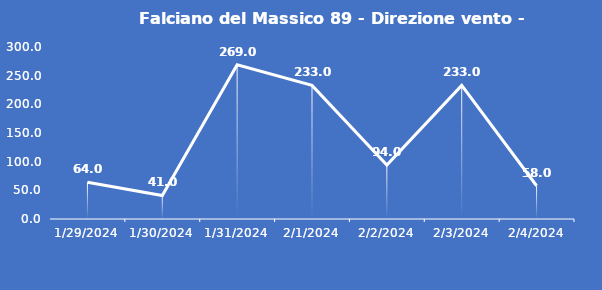
| Category | Falciano del Massico 89 - Direzione vento - Grezzo (°N) |
|---|---|
| 1/29/24 | 64 |
| 1/30/24 | 41 |
| 1/31/24 | 269 |
| 2/1/24 | 233 |
| 2/2/24 | 94 |
| 2/3/24 | 233 |
| 2/4/24 | 58 |